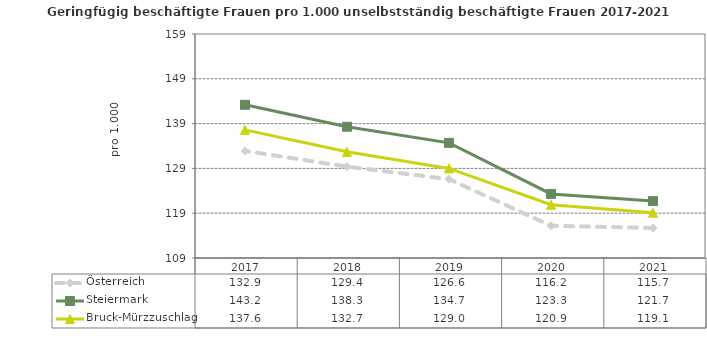
| Category | Österreich | Steiermark | Bruck-Mürzzuschlag |
|---|---|---|---|
| 2021.0 | 115.7 | 121.7 | 119.1 |
| 2020.0 | 116.2 | 123.3 | 120.9 |
| 2019.0 | 126.6 | 134.7 | 129 |
| 2018.0 | 129.4 | 138.3 | 132.7 |
| 2017.0 | 132.9 | 143.2 | 137.6 |